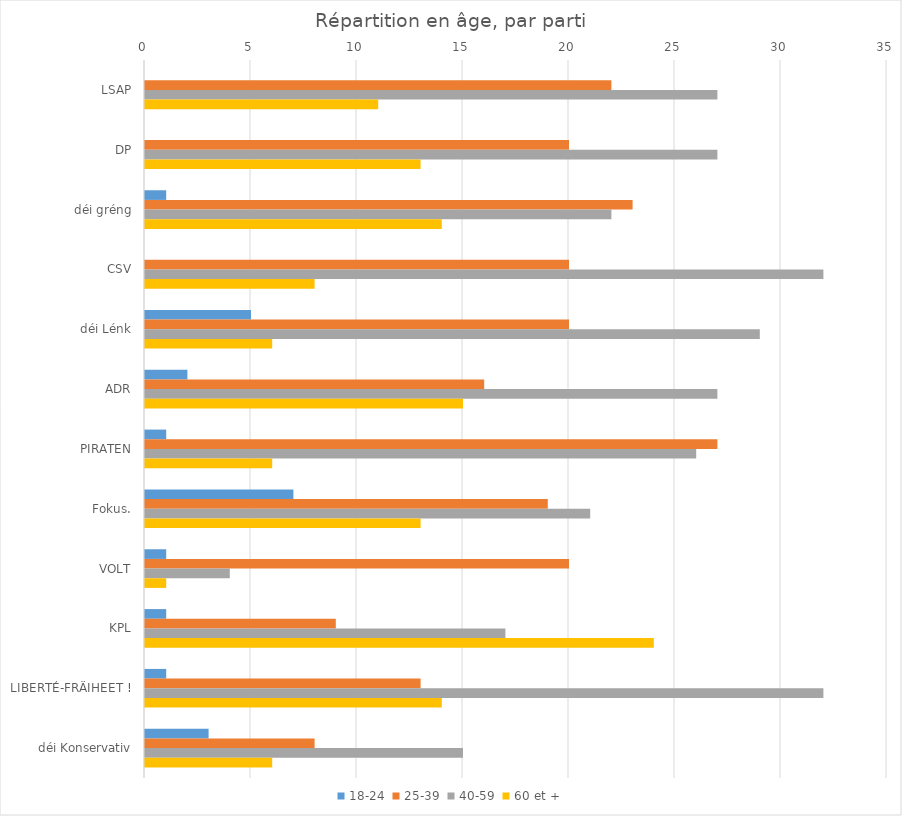
| Category | 18-24 | 25-39 | 40-59 | 60 et + |
|---|---|---|---|---|
| LSAP | 0 | 22 | 27 | 11 |
| DP | 0 | 20 | 27 | 13 |
| déi gréng | 1 | 23 | 22 | 14 |
| CSV | 0 | 20 | 32 | 8 |
| déi Lénk | 5 | 20 | 29 | 6 |
| ADR | 2 | 16 | 27 | 15 |
| PIRATEN | 1 | 27 | 26 | 6 |
| Fokus. | 7 | 19 | 21 | 13 |
| VOLT | 1 | 20 | 4 | 1 |
| KPL | 1 | 9 | 17 | 24 |
| LIBERTÉ-FRÄIHEET ! | 1 | 13 | 32 | 14 |
| déi Konservativ | 3 | 8 | 15 | 6 |